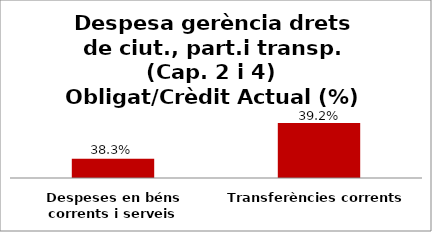
| Category | Series 0 |
|---|---|
| Despeses en béns corrents i serveis | 0.383 |
| Transferències corrents | 0.392 |